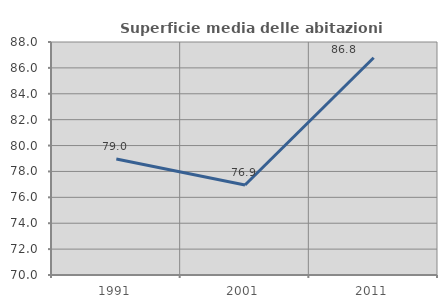
| Category | Superficie media delle abitazioni occupate |
|---|---|
| 1991.0 | 78.96 |
| 2001.0 | 76.949 |
| 2011.0 | 86.786 |